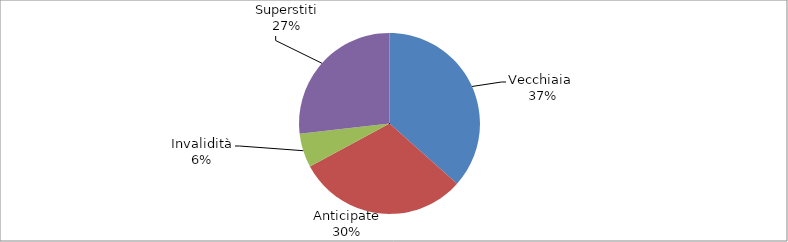
| Category | Series 0 |
|---|---|
| Vecchiaia  | 13356 |
| Anticipate | 11143 |
| Invalidità | 2218 |
| Superstiti | 9792 |